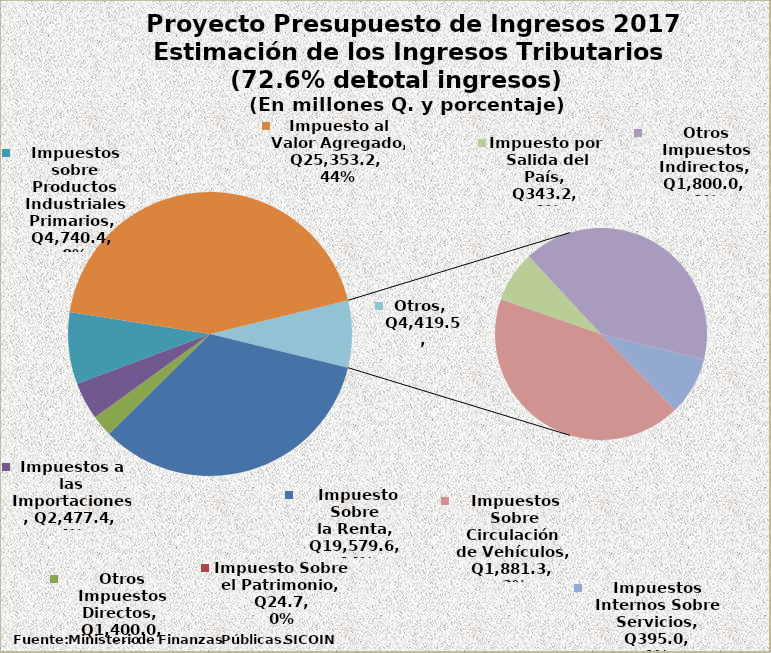
| Category | Series 0 |
|---|---|
| Impuesto Sobre la Renta | 19579.6 |
| Impuesto Sobre el Patrimonio | 24.7 |
| Otros Impuestos Directos | 1400 |
| Impuestos a las Importaciones | 2477.4 |
| Impuestos sobre Productos Industriales Primarios | 4740.4 |
| Impuesto al Valor Agregado | 25353.2 |
| Impuestos Internos Sobre Servicios | 395 |
| Impuestos Sobre Circulación de Vehículos | 1881.3 |
| Impuesto por Salida del País | 343.2 |
| Otros Impuestos Indirectos | 1800 |